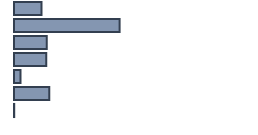
| Category | Percentatge |
|---|---|
| 0 | 11.435 |
| 1 | 44 |
| 2 | 13.696 |
| 3 | 13.391 |
| 4 | 2.696 |
| 5 | 14.696 |
| 6 | 0.087 |